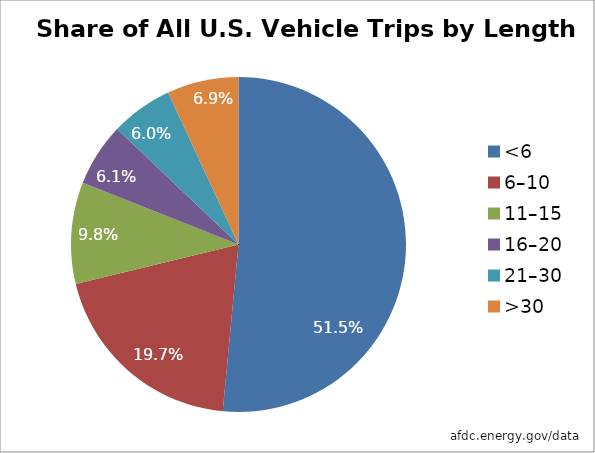
| Category | Series 0 |
|---|---|
| <6 | 0.515 |
| 6–10 | 0.197 |
| 11–15 | 0.098 |
| 16–20  | 0.061 |
| 21–30  | 0.06 |
| >30 | 0.069 |